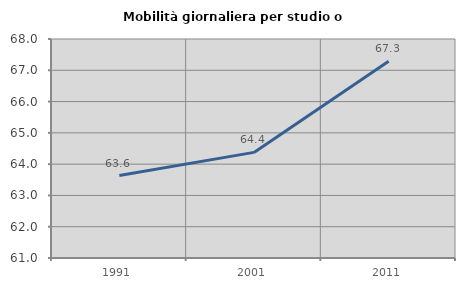
| Category | Mobilità giornaliera per studio o lavoro |
|---|---|
| 1991.0 | 63.637 |
| 2001.0 | 64.376 |
| 2011.0 | 67.285 |